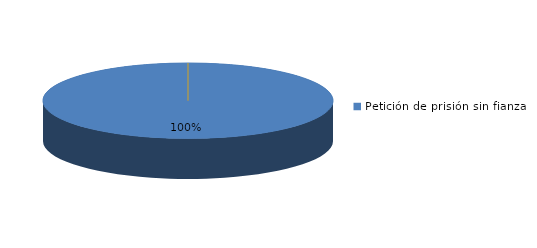
| Category | Series 0 |
|---|---|
| Petición de prisión sin fianza | 97 |
| Peticion de libertad con fianza | 0 |
| Petición de libertad | 0 |